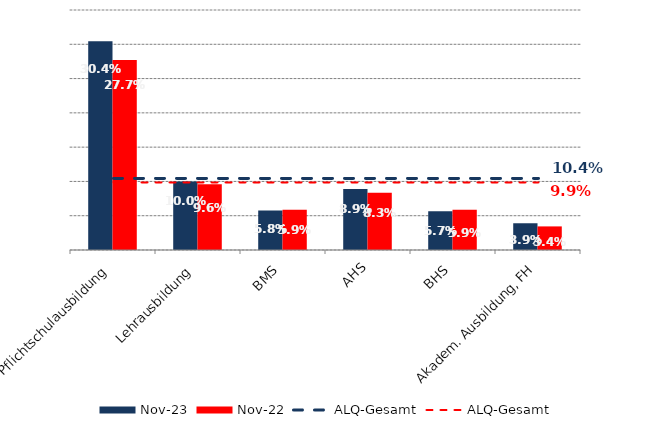
| Category | Nov 23 | Nov 22 |
|---|---|---|
| Pflichtschulausbildung | 0.304 | 0.277 |
| Lehrausbildung | 0.1 | 0.096 |
| BMS | 0.058 | 0.059 |
| AHS | 0.089 | 0.083 |
| BHS | 0.057 | 0.059 |
| Akadem. Ausbildung, FH | 0.039 | 0.034 |